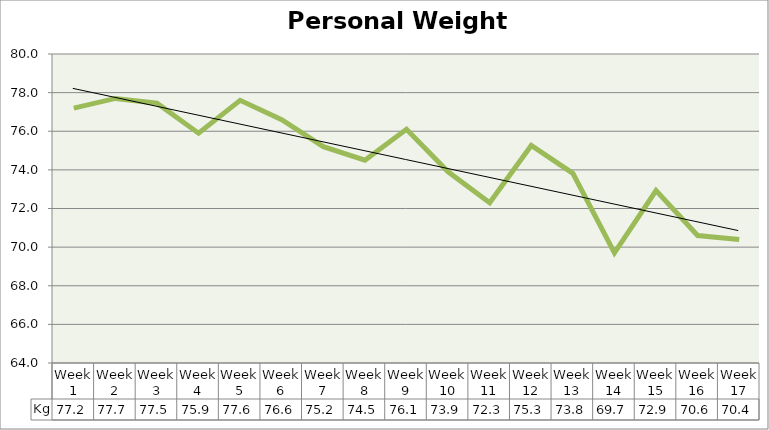
| Category | Kg |
|---|---|
| Week 1 | 77.2 |
| Week 2 | 77.7 |
| Week 3 | 77.45 |
| Week 4 | 75.9 |
| Week 5 | 77.6 |
| Week 6 | 76.6 |
| Week 7 | 75.2 |
| Week 8 | 74.5 |
| Week 9 | 76.1 |
| Week 10 | 73.9 |
| Week 11 | 72.3 |
| Week 12 | 75.262 |
| Week 13 | 73.821 |
| Week 14 | 69.7 |
| Week 15 | 72.928 |
| Week 16 | 70.6 |
| Week 17 | 70.4 |